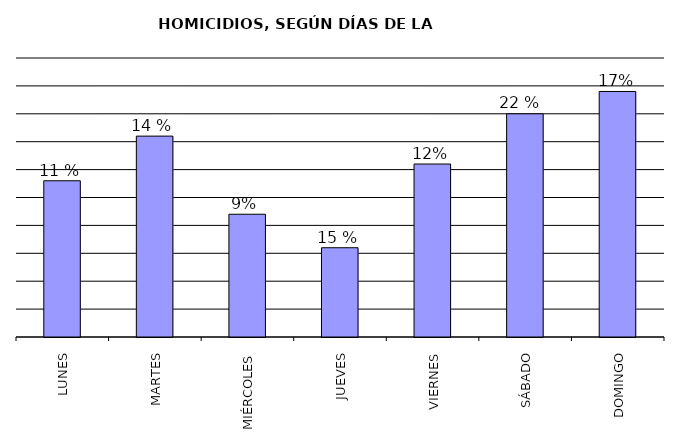
| Category | Series 0 |
|---|---|
| LUNES | 28 |
| MARTES | 36 |
| MIÉRCOLES | 22 |
| JUEVES | 16 |
| VIERNES | 31 |
| SÁBADO | 40 |
| DOMINGO | 44 |